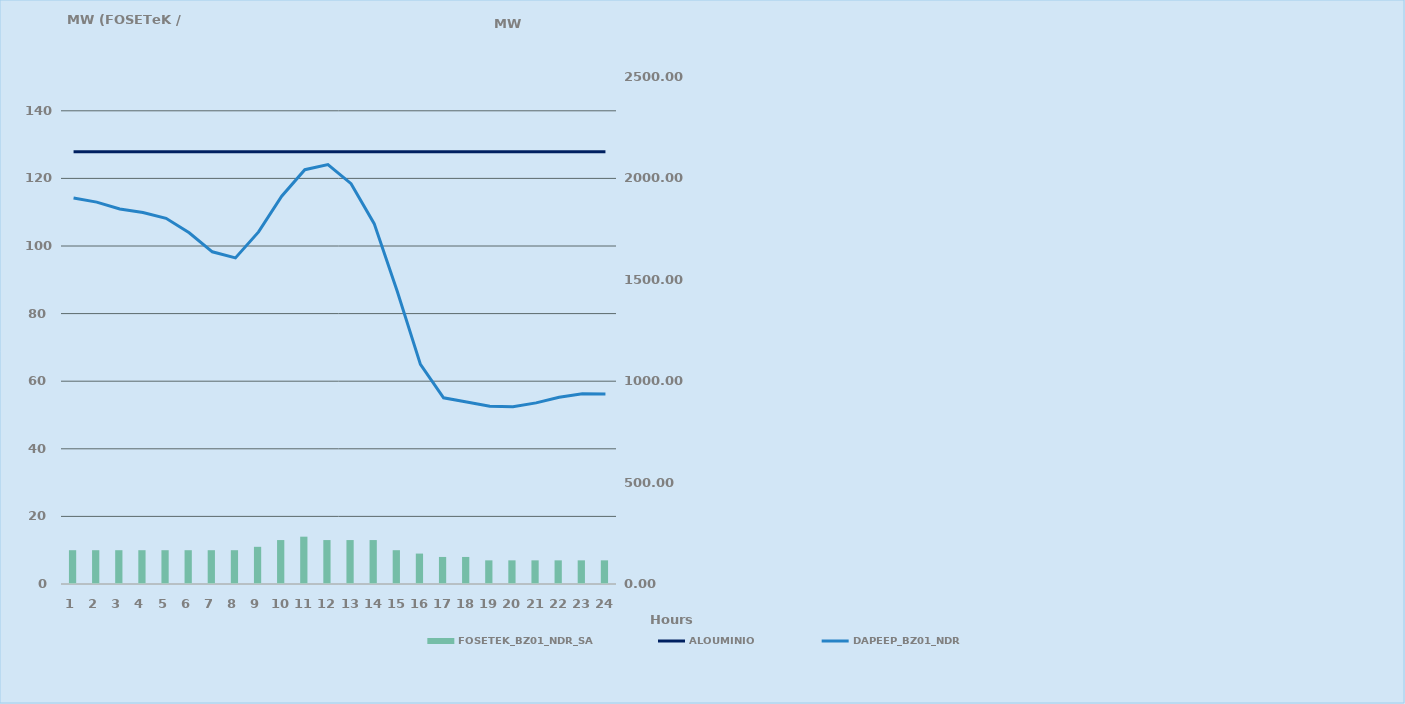
| Category | FOSETEK_BZ01_NDR_SA |
|---|---|
| 0 | 10 |
| 1 | 10 |
| 2 | 10 |
| 3 | 10 |
| 4 | 10 |
| 5 | 10 |
| 6 | 10 |
| 7 | 10 |
| 8 | 11 |
| 9 | 13 |
| 10 | 14 |
| 11 | 13 |
| 12 | 13 |
| 13 | 13 |
| 14 | 10 |
| 15 | 9 |
| 16 | 8 |
| 17 | 8 |
| 18 | 7 |
| 19 | 7 |
| 20 | 7 |
| 21 | 7 |
| 22 | 7 |
| 23 | 7 |